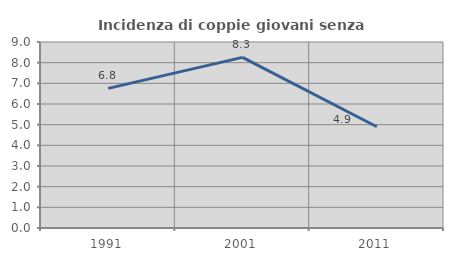
| Category | Incidenza di coppie giovani senza figli |
|---|---|
| 1991.0 | 6.757 |
| 2001.0 | 8.257 |
| 2011.0 | 4.897 |